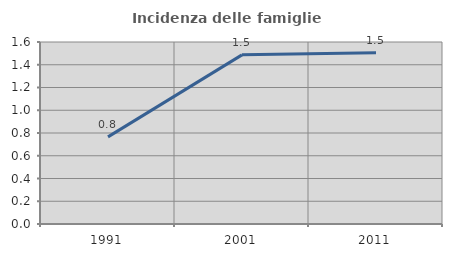
| Category | Incidenza delle famiglie numerose |
|---|---|
| 1991.0 | 0.766 |
| 2001.0 | 1.487 |
| 2011.0 | 1.505 |